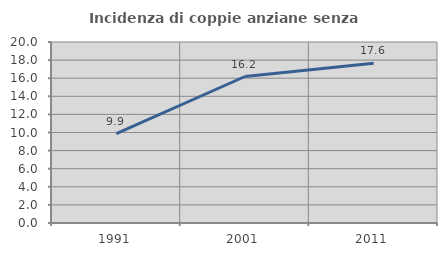
| Category | Incidenza di coppie anziane senza figli  |
|---|---|
| 1991.0 | 9.877 |
| 2001.0 | 16.188 |
| 2011.0 | 17.647 |